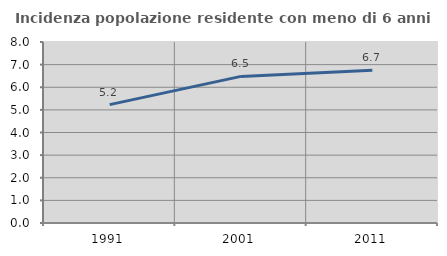
| Category | Incidenza popolazione residente con meno di 6 anni |
|---|---|
| 1991.0 | 5.232 |
| 2001.0 | 6.479 |
| 2011.0 | 6.748 |